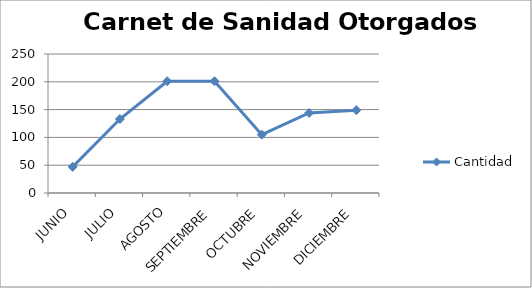
| Category | Cantidad |
|---|---|
| JUNIO | 47 |
| JULIO | 133 |
| AGOSTO | 201 |
| SEPTIEMBRE | 201 |
| OCTUBRE | 105 |
| NOVIEMBRE | 144 |
| DICIEMBRE | 149 |